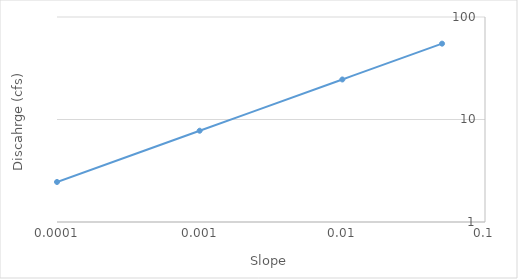
| Category | Q |
|---|---|
| 0.0001 | 2.457 |
| 0.001 | 7.771 |
| 0.01 | 24.574 |
| 0.05 | 54.948 |